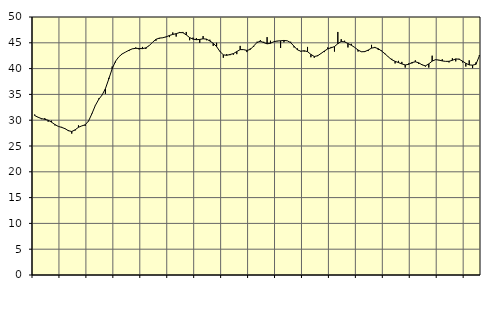
| Category | Piggar | Series 1 |
|---|---|---|
| nan | 31.1 | 30.9 |
| 87.0 | 30.6 | 30.58 |
| 87.0 | 30.2 | 30.31 |
| 87.0 | 30.4 | 30.17 |
| nan | 29.7 | 30 |
| 88.0 | 29.9 | 29.62 |
| 88.0 | 29 | 29.16 |
| 88.0 | 28.8 | 28.8 |
| nan | 28.7 | 28.61 |
| 89.0 | 28.4 | 28.36 |
| 89.0 | 28.1 | 27.97 |
| 89.0 | 27.4 | 27.81 |
| nan | 28 | 28.13 |
| 90.0 | 29 | 28.63 |
| 90.0 | 28.9 | 28.9 |
| 90.0 | 28.9 | 29.11 |
| nan | 29.8 | 29.86 |
| 91.0 | 31.2 | 31.27 |
| 91.0 | 32.8 | 32.85 |
| 91.0 | 34.2 | 34.02 |
| nan | 34.9 | 34.87 |
| 92.0 | 35.1 | 36.11 |
| 92.0 | 38.2 | 37.99 |
| 92.0 | 40.4 | 39.97 |
| nan | 41.2 | 41.43 |
| 93.0 | 42.3 | 42.3 |
| 93.0 | 42.9 | 42.85 |
| 93.0 | 43.2 | 43.21 |
| nan | 43.4 | 43.56 |
| 94.0 | 43.8 | 43.83 |
| 94.0 | 44.1 | 43.93 |
| 94.0 | 43.7 | 43.9 |
| nan | 44.2 | 43.87 |
| 95.0 | 43.8 | 44.02 |
| 95.0 | 44.5 | 44.45 |
| 95.0 | 45.1 | 45.11 |
| nan | 45.4 | 45.67 |
| 96.0 | 45.8 | 45.91 |
| 96.0 | 46 | 45.97 |
| 96.0 | 46.1 | 46.15 |
| nan | 46.1 | 46.42 |
| 97.0 | 47 | 46.62 |
| 97.0 | 46.2 | 46.77 |
| 97.0 | 47.1 | 46.98 |
| nan | 47.1 | 46.96 |
| 98.0 | 47.1 | 46.53 |
| 98.0 | 45.5 | 46.01 |
| 98.0 | 46 | 45.71 |
| nan | 45.9 | 45.6 |
| 99.0 | 45 | 45.65 |
| 99.0 | 46.3 | 45.78 |
| 99.0 | 45.5 | 45.71 |
| nan | 45.6 | 45.35 |
| 0.0 | 44.4 | 44.91 |
| 0.0 | 45 | 44.26 |
| 0.0 | 43.4 | 43.32 |
| nan | 42.1 | 42.67 |
| 1.0 | 42.8 | 42.57 |
| 1.0 | 42.6 | 42.73 |
| 1.0 | 42.7 | 42.91 |
| nan | 42.8 | 43.3 |
| 2.0 | 44.4 | 43.68 |
| 2.0 | 43.7 | 43.68 |
| 2.0 | 43.2 | 43.52 |
| nan | 43.9 | 43.71 |
| 3.0 | 44.2 | 44.37 |
| 3.0 | 45.2 | 45.07 |
| 3.0 | 45.5 | 45.3 |
| nan | 45.2 | 45.04 |
| 4.0 | 46.1 | 44.8 |
| 4.0 | 45.4 | 44.91 |
| 4.0 | 45.2 | 45.21 |
| nan | 45.3 | 45.35 |
| 5.0 | 44 | 45.39 |
| 5.0 | 45.1 | 45.46 |
| 5.0 | 45.4 | 45.39 |
| nan | 45.2 | 45.02 |
| 6.0 | 44.1 | 44.34 |
| 6.0 | 43.9 | 43.64 |
| 6.0 | 43.3 | 43.37 |
| nan | 43.3 | 43.46 |
| 7.0 | 44.2 | 43.29 |
| 7.0 | 42.2 | 42.75 |
| 7.0 | 42.1 | 42.35 |
| nan | 42.6 | 42.48 |
| 8.0 | 42.9 | 42.93 |
| 8.0 | 43.2 | 43.4 |
| 8.0 | 44.1 | 43.82 |
| nan | 44.2 | 44.03 |
| 9.0 | 43.3 | 44.27 |
| 9.0 | 47.1 | 44.83 |
| 9.0 | 45.7 | 45.25 |
| nan | 45.4 | 45.18 |
| 10.0 | 44.1 | 44.86 |
| 10.0 | 44.8 | 44.53 |
| 10.0 | 44.1 | 44.11 |
| nan | 43.3 | 43.6 |
| 11.0 | 43.3 | 43.26 |
| 11.0 | 43.4 | 43.29 |
| 11.0 | 43.4 | 43.59 |
| nan | 44.6 | 43.97 |
| 12.0 | 44.2 | 44.09 |
| 12.0 | 43.6 | 43.86 |
| 12.0 | 43.5 | 43.4 |
| nan | 42.8 | 42.87 |
| 13.0 | 42.3 | 42.26 |
| 13.0 | 41.9 | 41.72 |
| 13.0 | 41 | 41.41 |
| nan | 41.5 | 41.17 |
| 14.0 | 41.3 | 40.91 |
| 14.0 | 40.2 | 40.71 |
| 14.0 | 41 | 40.82 |
| nan | 41 | 41.17 |
| 15.0 | 41.6 | 41.32 |
| 15.0 | 40.9 | 41.13 |
| 15.0 | 40.8 | 40.73 |
| nan | 40.4 | 40.53 |
| 16.0 | 40.2 | 40.91 |
| 16.0 | 42.5 | 41.45 |
| 16.0 | 41.7 | 41.73 |
| nan | 41.6 | 41.66 |
| 17.0 | 41.8 | 41.49 |
| 17.0 | 41.4 | 41.4 |
| 17.0 | 41.2 | 41.41 |
| nan | 42 | 41.61 |
| 18.0 | 41.4 | 41.88 |
| 18.0 | 41.9 | 41.82 |
| 18.0 | 41.2 | 41.45 |
| nan | 40.4 | 41.03 |
| 19.0 | 41.6 | 40.71 |
| 19.0 | 40.1 | 40.67 |
| 19.0 | 41.2 | 40.83 |
| nan | 42.6 | 42.44 |